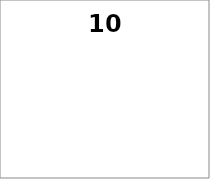
| Category | Series 0 |
|---|---|
| 5.0 | 0 |
| 4.0 | 0 |
| 3.0 | 0 |
| 2.0 | 0 |